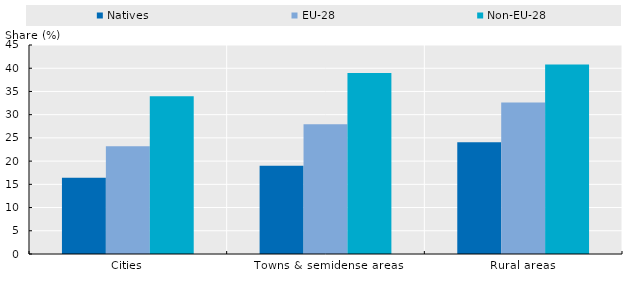
| Category | Natives | EU-28 | Non-EU-28 |
|---|---|---|---|
| Cities | 16.442 | 23.191 | 33.971 |
| Towns & semidense areas | 19.004 | 27.932 | 38.983 |
| Rural areas | 24.08 | 32.595 | 40.783 |